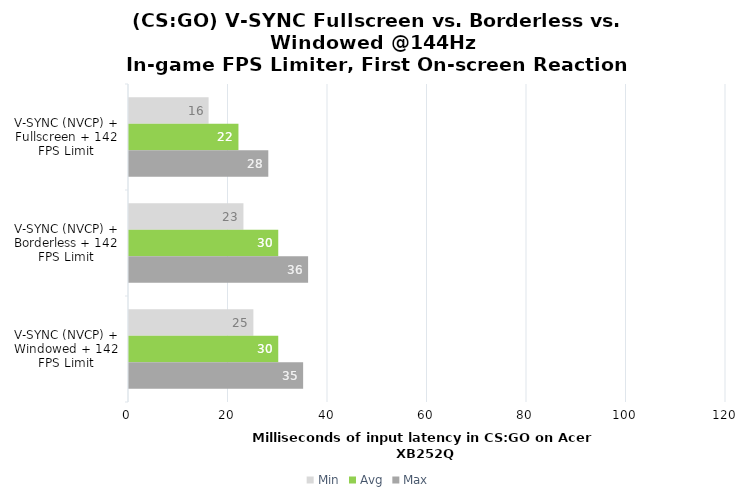
| Category | Min | Avg | Max |
|---|---|---|---|
| V-SYNC (NVCP) + Fullscreen + 142 FPS Limit | 16 | 22 | 28 |
| V-SYNC (NVCP) + Borderless + 142 FPS Limit | 23 | 30 | 36 |
| V-SYNC (NVCP) + Windowed + 142 FPS Limit | 25 | 30 | 35 |